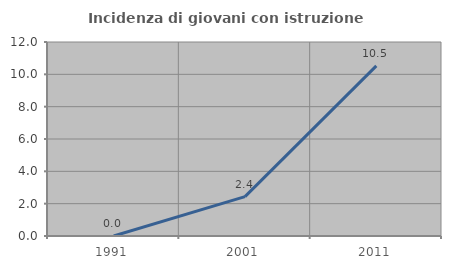
| Category | Incidenza di giovani con istruzione universitaria |
|---|---|
| 1991.0 | 0 |
| 2001.0 | 2.439 |
| 2011.0 | 10.526 |